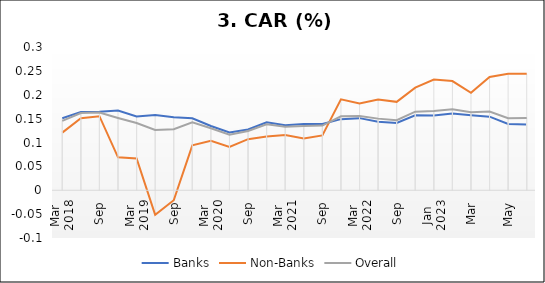
| Category | Banks | Non-Banks | Overall |
|---|---|---|---|
| 0 | 0.151 | 0.121 | 0.145 |
| 1 | 0.164 | 0.151 | 0.162 |
| 2 | 0.164 | 0.155 | 0.163 |
| 3 | 0.167 | 0.069 | 0.151 |
| 4 | 0.155 | 0.067 | 0.141 |
| 5 | 0.158 | -0.051 | 0.126 |
| 6 | 0.153 | -0.021 | 0.128 |
| 7 | 0.151 | 0.094 | 0.142 |
| 8 | 0.135 | 0.103 | 0.13 |
| 9 | 0.121 | 0.091 | 0.116 |
| 10 | 0.127 | 0.107 | 0.124 |
| 11 | 0.142 | 0.113 | 0.138 |
| 12 | 0.136 | 0.116 | 0.133 |
| 13 | 0.139 | 0.109 | 0.134 |
| 14 | 0.139 | 0.115 | 0.136 |
| 15 | 0.149 | 0.191 | 0.155 |
| 16 | 0.151 | 0.182 | 0.156 |
| 17 | 0.144 | 0.19 | 0.15 |
| 18 | 0.141 | 0.185 | 0.147 |
| 19 | 0.157 | 0.215 | 0.165 |
| 20 | 0.156 | 0.232 | 0.166 |
| 21 | 0.161 | 0.229 | 0.169 |
| 22 | 0.157 | 0.204 | 0.163 |
| 23 | 0.154 | 0.237 | 0.165 |
| 24 | 0.139 | 0.244 | 0.151 |
| 25 | 0.138 | 0.244 | 0.151 |